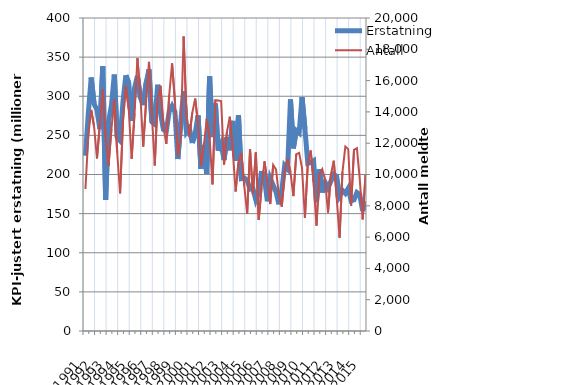
| Category | Erstatning |
|---|---|
| 1991.0 | 224.004 |
| nan | 278.701 |
| nan | 323.912 |
| nan | 290.109 |
| 1992.0 | 282.405 |
| nan | 258.04 |
| nan | 338.16 |
| nan | 167.714 |
| 1993.0 | 267.55 |
| nan | 288.274 |
| nan | 327.744 |
| nan | 247.473 |
| 1994.0 | 243.261 |
| nan | 292.909 |
| nan | 326.717 |
| nan | 316.969 |
| 1995.0 | 268.377 |
| nan | 310.462 |
| nan | 326.029 |
| nan | 298.546 |
| 1996.0 | 288.624 |
| nan | 316.842 |
| nan | 334.294 |
| nan | 267.261 |
| 1997.0 | 264.232 |
| nan | 314.716 |
| nan | 278.564 |
| nan | 257.522 |
| 1998.0 | 255.602 |
| nan | 280.391 |
| nan | 287.517 |
| nan | 279.782 |
| 1999.0 | 219.796 |
| nan | 266.7 |
| nan | 306.511 |
| nan | 254.224 |
| 2000.0 | 259.141 |
| nan | 240.324 |
| nan | 252.088 |
| nan | 275.595 |
| 2001.0 | 207.244 |
| nan | 237.701 |
| nan | 200.728 |
| nan | 325.563 |
| 2002.0 | 247.873 |
| nan | 290.601 |
| nan | 230.457 |
| nan | 239.267 |
| 2003.0 | 218.61 |
| nan | 247.712 |
| nan | 230.981 |
| nan | 268.572 |
| 2004.0 | 217.508 |
| nan | 275.732 |
| nan | 194.81 |
| nan | 195.623 |
| 2005.0 | 192.286 |
| nan | 181.226 |
| nan | 181.978 |
| nan | 167.584 |
| 2006.0 | 176.819 |
| nan | 204.479 |
| nan | 195.021 |
| nan | 165.776 |
| 2007.0 | 195.039 |
| nan | 186.314 |
| nan | 177.691 |
| nan | 161.832 |
| 2008.0 | 179.801 |
| nan | 211.41 |
| nan | 207.185 |
| nan | 295.976 |
| 2009.0 | 233.497 |
| nan | 256.265 |
| nan | 253.058 |
| nan | 298.888 |
| 2010.0 | 258.589 |
| nan | 214.112 |
| nan | 214.991 |
| nan | 217.554 |
| 2011.0 | 164.553 |
| nan | 206.709 |
| nan | 176.997 |
| nan | 189.985 |
| 2012.0 | 182.676 |
| nan | 191.481 |
| nan | 200.115 |
| nan | 197.486 |
| 2013.0 | 172.77 |
| nan | 179.578 |
| nan | 175.887 |
| nan | 182.23 |
| 2014.0 | 166.5 |
| nan | 167.566 |
| nan | 176.903 |
| nan | 174.149 |
| 2015.0 | 153.686 |
| nan | 165.587 |